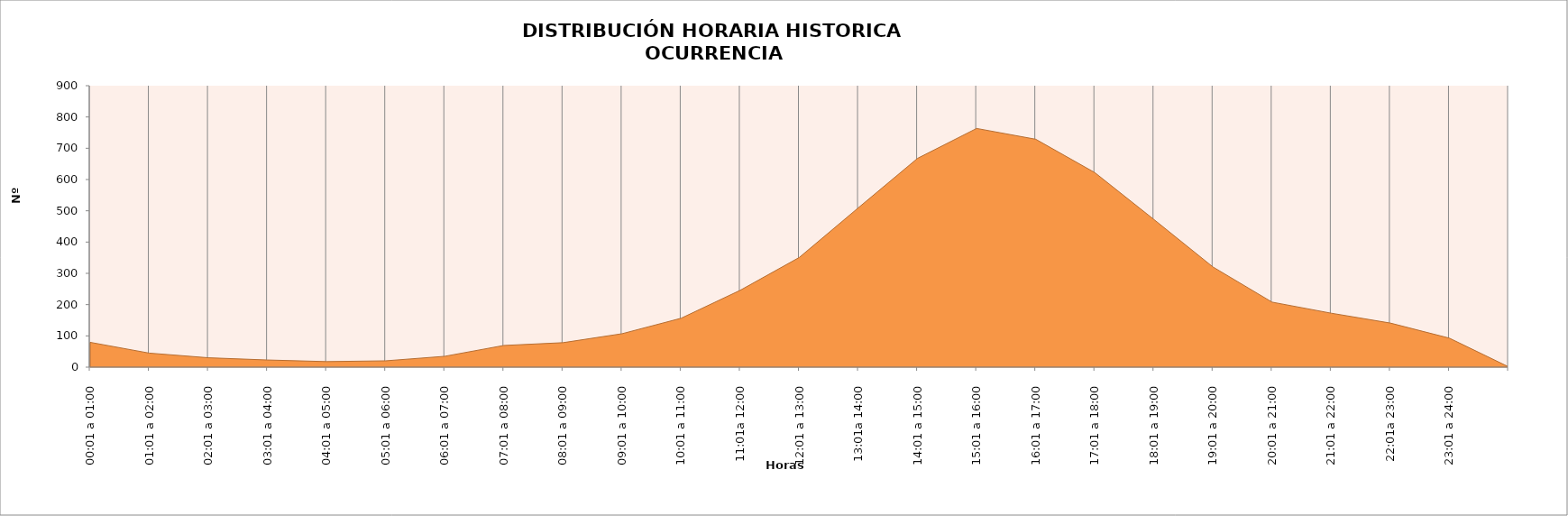
| Category | Promedio 1985-2023 |
|---|---|
| 00:01 a 01:00 | 79.41 |
| 01:01 a 02:00 | 44.897 |
| 02:01 a 03:00 | 30.051 |
| 03:01 a 04:00 | 22.923 |
| 04:01 a 05:00 | 17.795 |
| 05:01 a 06:00 | 20.282 |
| 06:01 a 07:00 | 34.744 |
| 07:01 a 08:00 | 69.41 |
| 08:01 a 09:00 | 78.282 |
| 09:01 a 10:00 | 106.949 |
| 10:01 a 11:00 | 156.41 |
| 11:01a 12:00 | 245.846 |
| 12:01 a 13:00 | 350.872 |
| 13:01a 14:00 | 509.846 |
| 14:01 a 15:00 | 667.615 |
| 15:01 a 16:00 | 763.308 |
| 16:01 a 17:00 | 728.795 |
| 17:01 a 18:00 | 622.103 |
| 18:01 a 19:00 | 472.256 |
| 19:01 a 20:00 | 320.282 |
| 20:01 a 21:00 | 207.897 |
| 21:01 a 22:00 | 172.564 |
| 22:01a 23:00 | 141.026 |
| 23:01 a 24:00 | 92.718 |